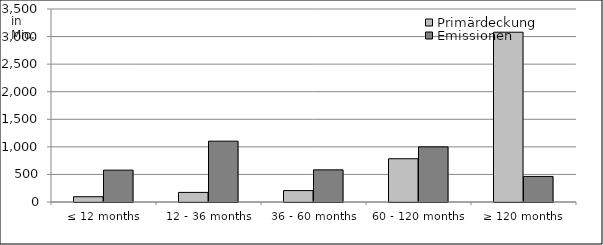
| Category | Primärdeckung | Emissionen |
|---|---|---|
| ≤ 12 months | 95611397.38 | 578000000 |
| 12 - 36 months | 173737610.24 | 1103378446.27 |
| 36 - 60 months | 206863640.095 | 582650000 |
| 60 - 120 months | 784590193.63 | 1000000000 |
| ≥ 120 months | 3079050323.947 | 463733665.9 |